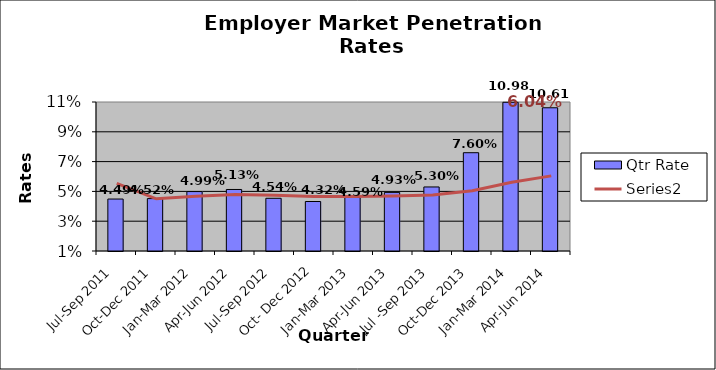
| Category | Qtr Rate |
|---|---|
| Jul-Sep 2011 | 0.045 |
| Oct-Dec 2011 | 0.045 |
| Jan-Mar 2012 | 0.05 |
| Apr-Jun 2012 | 0.051 |
| Jul-Sep 2012 | 0.045 |
| Oct- Dec 2012 | 0.043 |
| Jan-Mar 2013 | 0.046 |
| Apr-Jun 2013 | 0.049 |
| Jul -Sep 2013 | 0.053 |
| Oct-Dec 2013 | 0.076 |
| Jan-Mar 2014 | 0.11 |
| Apr-Jun 2014 | 0.106 |